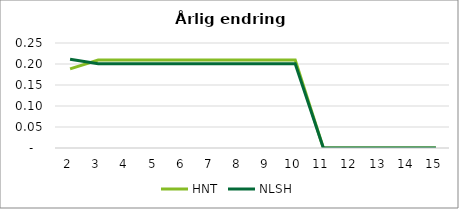
| Category | HNT | NLSH |
|---|---|---|
| 2.0 | 0.188 | 0.211 |
| 3.0 | 0.21 | 0.201 |
| 4.0 | 0.21 | 0.201 |
| 5.0 | 0.21 | 0.201 |
| 6.0 | 0.21 | 0.201 |
| 7.0 | 0.21 | 0.201 |
| 8.0 | 0.21 | 0.201 |
| 9.0 | 0.21 | 0.201 |
| 10.0 | 0.21 | 0.201 |
| 11.0 | 0 | 0 |
| 12.0 | 0 | 0 |
| 13.0 | 0 | 0 |
| 14.0 | 0 | 0 |
| 15.0 | 0 | 0 |